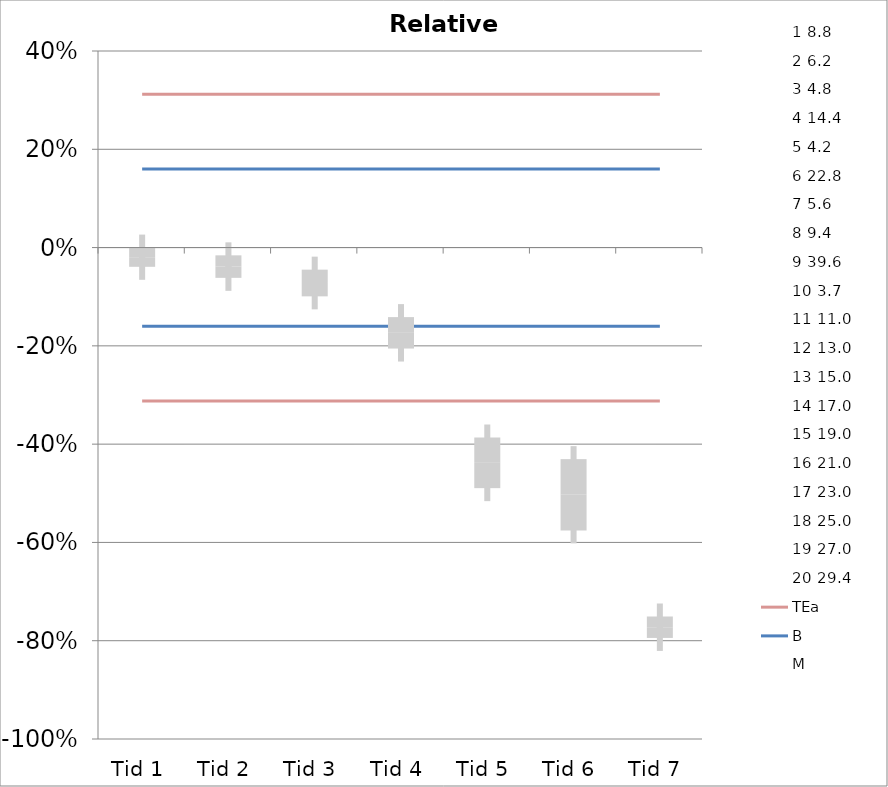
| Category | 1 | 2 | 3 | 4 | 5 | 6 | 7 | 8 | 9 | 10 | 11 | 12 | 13 | 14 | 15 | 16 | 17 | 18 | 19 | 20 | TEa | B | -B | -TEa | M |
|---|---|---|---|---|---|---|---|---|---|---|---|---|---|---|---|---|---|---|---|---|---|---|---|---|---|
| Tid 1 | 0.005 | -0.021 | -0.006 | -0.074 | 0.009 | -0.003 | -0.004 | -0.007 | 0.004 | 0.024 | 0.036 | -0.031 | -0.16 | 0 | -0.037 | -0.038 | -0.043 | 0.004 | -0.037 | -0.014 | 0.312 | 0.16 | -0.16 | -0.312 | -0.02 |
| Tid 2 | -0.013 | -0.002 | -0.006 | -0.033 | 0.012 | -0.037 | -0.021 | -0.014 | -0.033 | 0.003 | 0 | -0.077 | -0.187 | -0.029 | -0.105 | -0.119 | -0.035 | -0.004 | -0.044 | -0.031 | 0.312 | 0.16 | -0.16 | -0.312 | -0.039 |
| Tid 3 | -0.04 | 0 | -0.019 | -0.048 | -0.026 | -0.092 | -0.029 | -0.012 | -0.03 | -0.024 | -0.155 | -0.069 | -0.2 | -0.118 | -0.158 | -0.143 | -0.126 | -0.04 | -0.067 | -0.048 | 0.312 | 0.16 | -0.16 | -0.312 | -0.072 |
| Tid 4 | -0.143 | -0.166 | -0.214 | -0.133 | -0.26 | -0.225 | -0.014 | -0.052 | -0.214 | -0.257 | -0.136 | -0.1 | -0.253 | -0.124 | -0.195 | -0.162 | -0.161 | -0.216 | -0.185 | -0.259 | 0.312 | 0.16 | -0.16 | -0.312 | -0.173 |
| Tid 5 | -0.049 | -0.5 | -0.352 | -0.551 | -0.442 | -0.591 | -0.451 | -0.414 | -0.389 | -0.563 | -0.421 | -0.484 | -0.484 | -0.415 | -0.51 | -0.406 | -0.456 | -0.42 | -0.417 | -0.443 | 0.312 | 0.16 | -0.16 | -0.312 | -0.438 |
| Tid 6 | -0.217 | -0.683 | -0.648 | -0.424 | -0.7 | -0.7 | -0.558 | -0.129 | -0.438 | -0.769 | -0.449 | -0.422 | -0.454 | -0.564 | -0.497 | -0.481 | -0.458 | -0.489 | -0.477 | -0.502 | 0.312 | 0.16 | -0.16 | -0.312 | -0.503 |
| Tid 7 | -0.749 | -0.833 | -0.751 | -0.726 | -0.721 | -0.882 | -0.648 | -0.807 | -0.751 | -0.805 | -0.784 | -0.776 | -0.782 | -0.754 | -0.787 | -0.795 | -0.767 | -0.774 | -0.78 | -0.779 | 0.312 | 0.16 | -0.16 | -0.312 | -0.773 |